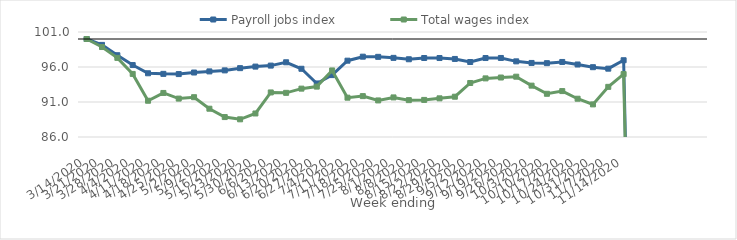
| Category | Payroll jobs index | Total wages index |
|---|---|---|
| 14/03/2020 | 100 | 100 |
| 21/03/2020 | 99.157 | 98.855 |
| 28/03/2020 | 97.682 | 97.302 |
| 04/04/2020 | 96.277 | 95.013 |
| 11/04/2020 | 95.105 | 91.179 |
| 18/04/2020 | 95.019 | 92.293 |
| 25/04/2020 | 94.988 | 91.486 |
| 02/05/2020 | 95.211 | 91.687 |
| 09/05/2020 | 95.372 | 90.041 |
| 16/05/2020 | 95.517 | 88.848 |
| 23/05/2020 | 95.835 | 88.526 |
| 30/05/2020 | 96.058 | 89.36 |
| 06/06/2020 | 96.2 | 92.365 |
| 13/06/2020 | 96.674 | 92.309 |
| 20/06/2020 | 95.748 | 92.909 |
| 27/06/2020 | 93.648 | 93.198 |
| 04/07/2020 | 94.843 | 95.508 |
| 11/07/2020 | 96.903 | 91.618 |
| 18/07/2020 | 97.475 | 91.84 |
| 25/07/2020 | 97.451 | 91.224 |
| 01/08/2020 | 97.305 | 91.655 |
| 08/08/2020 | 97.105 | 91.264 |
| 15/08/2020 | 97.284 | 91.297 |
| 22/08/2020 | 97.282 | 91.523 |
| 29/08/2020 | 97.151 | 91.756 |
| 05/09/2020 | 96.713 | 93.715 |
| 12/09/2020 | 97.282 | 94.373 |
| 19/09/2020 | 97.292 | 94.496 |
| 26/09/2020 | 96.807 | 94.614 |
| 03/10/2020 | 96.58 | 93.336 |
| 10/10/2020 | 96.548 | 92.172 |
| 17/10/2020 | 96.721 | 92.56 |
| 24/10/2020 | 96.358 | 91.467 |
| 31/10/2020 | 95.972 | 90.657 |
| 07/11/2020 | 95.763 | 93.164 |
| 14/11/2020 | 96.965 | 94.988 |